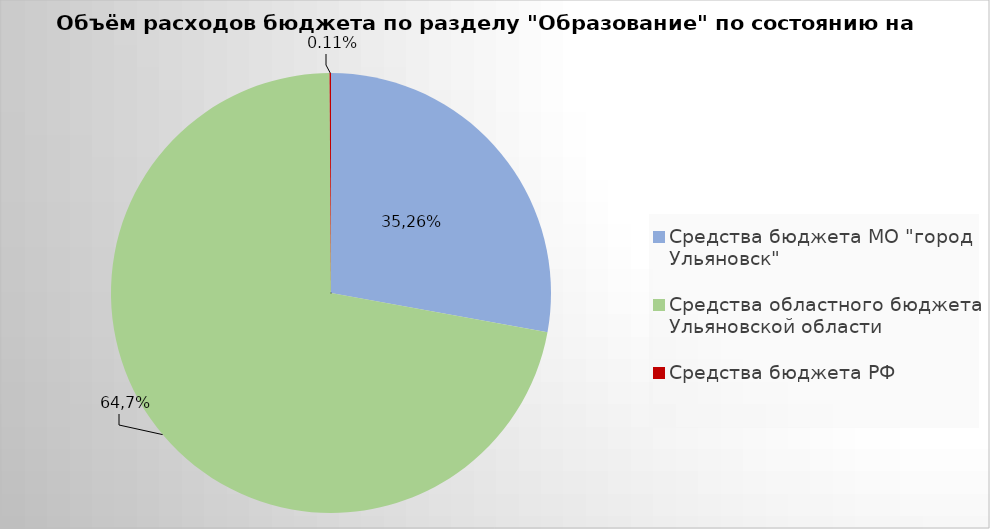
| Category | Series 0 |
|---|---|
| Средства бюджета МО "город Ульяновск" | 1650179.76 |
| Средства областного бюджета Ульяновской области | 4268687.49 |
| Средства бюджета РФ | 6333.1 |